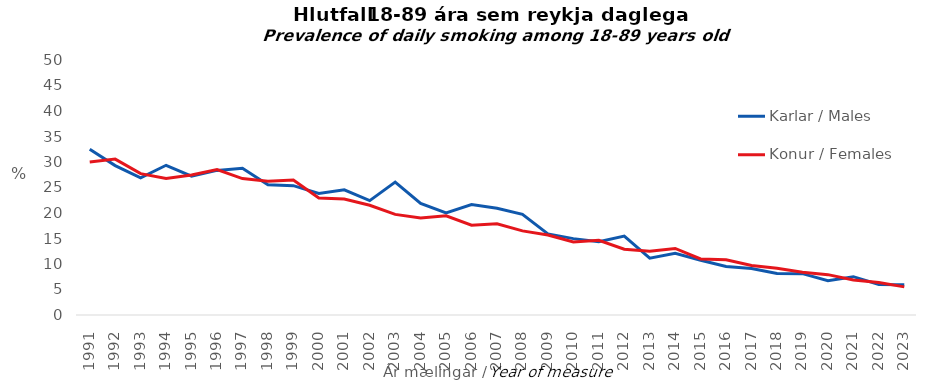
| Category | Karlar / Males | Konur / Females |
|---|---|---|
| 1991.0 | 32.5 | 30.019 |
| 1992.0 | 29.295 | 30.57 |
| 1993.0 | 26.905 | 27.715 |
| 1994.0 | 29.357 | 26.771 |
| 1995.0 | 27.241 | 27.46 |
| 1996.0 | 28.352 | 28.53 |
| 1997.0 | 28.779 | 26.753 |
| 1998.0 | 25.54 | 26.239 |
| 1999.0 | 25.362 | 26.461 |
| 2000.0 | 23.814 | 22.952 |
| 2001.0 | 24.559 | 22.727 |
| 2002.0 | 22.424 | 21.512 |
| 2003.0 | 26.049 | 19.73 |
| 2004.0 | 21.878 | 19.032 |
| 2005.0 | 20.035 | 19.451 |
| 2006.0 | 21.648 | 17.601 |
| 2007.0 | 20.945 | 17.892 |
| 2008.0 | 19.746 | 16.496 |
| 2009.0 | 15.903 | 15.691 |
| 2010.0 | 14.976 | 14.305 |
| 2011.0 | 14.379 | 14.644 |
| 2012.0 | 15.487 | 12.898 |
| 2013.0 | 11.127 | 12.491 |
| 2014.0 | 12.099 | 13.047 |
| 2015.0 | 10.727 | 10.995 |
| 2016.0 | 9.513 | 10.842 |
| 2017.0 | 9.132 | 9.696 |
| 2018.0 | 8.126 | 9.149 |
| 2019.0 | 8.108 | 8.392 |
| 2020.0 | 6.719 | 7.911 |
| 2021.0 | 7.513 | 6.848 |
| 2022.0 | 5.988 | 6.361 |
| 2023.0 | 5.911 | 5.515 |